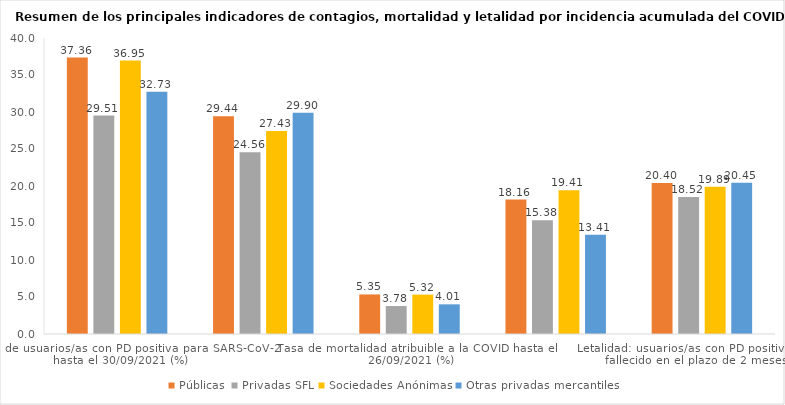
| Category | Públicas | Privadas SFL | Sociedades Anónimas | Otras privadas mercantiles |
|---|---|---|---|---|
| Tasa de usuarios/as con PD positiva para SARS-CoV-2 hasta el 30/09/2021 (%) | 37.361 | 29.514 | 36.954 | 32.732 |
| Tasa de mortalidad por todas las causas hasta el 26/09/2021 (%) | 29.441 | 24.563 | 27.433 | 29.903 |
| Tasa de mortalidad atribuible a la COVID hasta el 26/09/2021 (%) | 5.348 | 3.777 | 5.325 | 4.009 |
| Proporción de los fallecimientos totales atribuibles a la COVID hasta el 26/09/2021 (%) | 18.163 | 15.377 | 19.409 | 13.406 |
| Letalidad: usuarios/as con PD positiva que han fallecido en el plazo de 2 meses (%) | 20.397 | 18.521 | 19.89 | 20.449 |